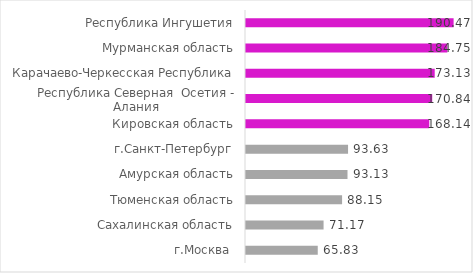
| Category | Series 0 |
|---|---|
| Республика Ингушетия | 190.471 |
| Мурманская область | 184.749 |
| Карачаево-Черкесская Республика | 173.134 |
| Республика Северная  Осетия - Алания | 170.841 |
| Кировская область | 168.136 |
| г.Санкт-Петербург | 93.629 |
| Амурская область | 93.129 |
| Тюменская область | 88.152 |
| Сахалинская область | 71.17 |
| г.Москва  | 65.831 |